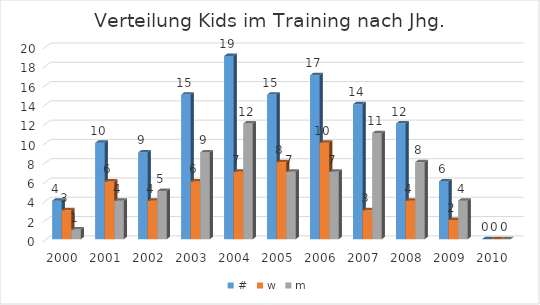
| Category | # | w | m |
|---|---|---|---|
| 2000.0 | 4 | 3 | 1 |
| 2001.0 | 10 | 6 | 4 |
| 2002.0 | 9 | 4 | 5 |
| 2003.0 | 15 | 6 | 9 |
| 2004.0 | 19 | 7 | 12 |
| 2005.0 | 15 | 8 | 7 |
| 2006.0 | 17 | 10 | 7 |
| 2007.0 | 14 | 3 | 11 |
| 2008.0 | 12 | 4 | 8 |
| 2009.0 | 6 | 2 | 4 |
| 2010.0 | 0 | 0 | 0 |